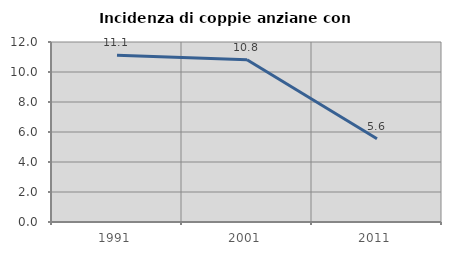
| Category | Incidenza di coppie anziane con figli |
|---|---|
| 1991.0 | 11.111 |
| 2001.0 | 10.811 |
| 2011.0 | 5.556 |